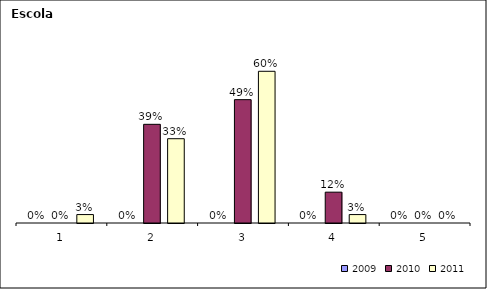
| Category | 2009 | 2010 | 2011 |
|---|---|---|---|
| 1.0 | 0 | 0 | 0.033 |
| 2.0 | 0 | 0.39 | 0.333 |
| 3.0 | 0 | 0.488 | 0.6 |
| 4.0 | 0 | 0.122 | 0.033 |
| 5.0 | 0 | 0 | 0 |